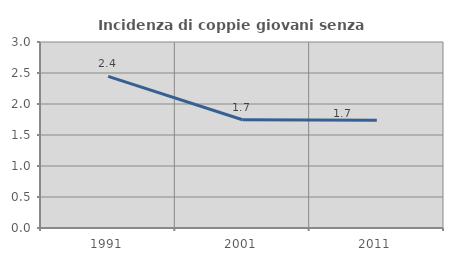
| Category | Incidenza di coppie giovani senza figli |
|---|---|
| 1991.0 | 2.446 |
| 2001.0 | 1.745 |
| 2011.0 | 1.737 |